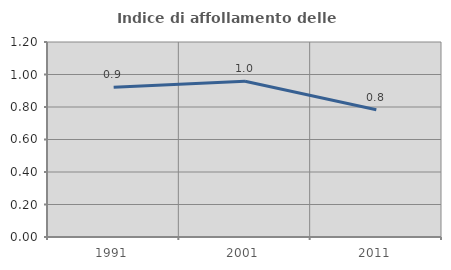
| Category | Indice di affollamento delle abitazioni  |
|---|---|
| 1991.0 | 0.922 |
| 2001.0 | 0.958 |
| 2011.0 | 0.783 |